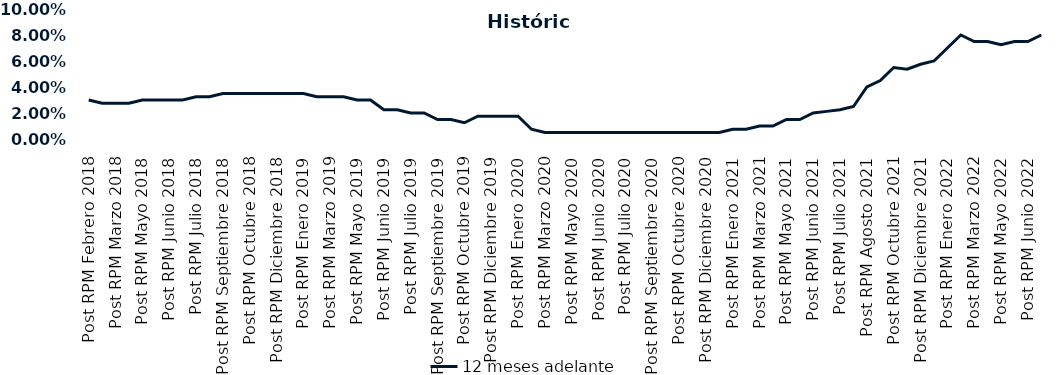
| Category | 12 meses adelante  |
|---|---|
| Post RPM Febrero 2018 | 0.03 |
| Pre RPM Marzo 2018 | 0.028 |
| Post RPM Marzo 2018 | 0.028 |
| Pre RPM Mayo 2018 | 0.028 |
| Post RPM Mayo 2018 | 0.03 |
| Pre RPM Junio 2018 | 0.03 |
| Post RPM Junio 2018 | 0.03 |
| Pre RPM Julio 2018 | 0.03 |
| Post RPM Julio 2018 | 0.032 |
| Pre RPM Septiembre 2018 | 0.032 |
| Post RPM Septiembre 2018 | 0.035 |
| Pre RPM Octubre 2018 | 0.035 |
| Post RPM Octubre 2018 | 0.035 |
| Pre RPM Diciembre 2018 | 0.035 |
| Post RPM Diciembre 2018 | 0.035 |
| Pre RPM Enero 2019 | 0.035 |
| Post RPM Enero 2019 | 0.035 |
| Pre RPM Marzo 2019 | 0.032 |
| Post RPM Marzo 2019 | 0.032 |
| Pre RPM Mayo 2019 | 0.032 |
| Post RPM Mayo 2019 | 0.03 |
| Pre RPM Junio 2019 | 0.03 |
| Post RPM Junio 2019 | 0.022 |
| Pre RPM Julio 2019 | 0.022 |
| Post RPM Julio 2019 | 0.02 |
| Pre RPM Septiembre 2019 | 0.02 |
| Post RPM Septiembre 2019 | 0.015 |
| Pre RPM Octubre 2019 | 0.015 |
| Post RPM Octubre 2019 | 0.012 |
| Pre RPM Diciembre 2019 | 0.018 |
| Post RPM Diciembre 2019 | 0.018 |
| Pre RPM Enero 2020 | 0.018 |
| Post RPM Enero 2020 | 0.018 |
| Pre RPM Marzo 2020 | 0.008 |
| Post RPM Marzo 2020 | 0.005 |
| Pre RPM Mayo 2020 | 0.005 |
| Post RPM Mayo 2020 | 0.005 |
| Pre RPM Junio 2020 | 0.005 |
| Post RPM Junio 2020 | 0.005 |
| Pre RPM Julio 2020 | 0.005 |
| Post RPM Julio 2020 | 0.005 |
| Pre RPM Septiembre 2020 | 0.005 |
| Post RPM Septiembre 2020 | 0.005 |
| Pre RPM Octubre 2020 | 0.005 |
| Post RPM Octubre 2020 | 0.005 |
| Pre RPM Diciembre 2020 | 0.005 |
| Post RPM Diciembre 2020 | 0.005 |
| Pre RPM Enero 2021 | 0.005 |
| Post RPM Enero 2021 | 0.008 |
| Pre RPM Marzo 2021 | 0.008 |
| Post RPM Marzo 2021 | 0.01 |
| Pre RPM Mayo 2021 | 0.01 |
| Post RPM Mayo 2021 | 0.015 |
| Pre RPM Junio 2021 | 0.015 |
| Post RPM Junio 2021 | 0.02 |
| Pre RPM Julio 2021 | 0.021 |
| Post RPM Julio 2021 | 0.022 |
| Pre RPM Agosto 2021 | 0.025 |
| Post RPM Agosto 2021 | 0.04 |
| Pre RPM Octubre 2021 | 0.045 |
| Post RPM Octubre 2021 | 0.055 |
| Pre RPM Diciembre 2021 | 0.054 |
| Post RPM Diciembre 2021 | 0.058 |
| Pre RPM Enero 2022 | 0.06 |
| Post RPM Enero 2022 | 0.07 |
| Pre RPM Marzo 2022 | 0.08 |
| Post RPM Marzo 2022 | 0.075 |
| Pre RPM Mayo 2022 | 0.075 |
| Post RPM Mayo 2022 | 0.072 |
| Pre RPM Junio 2022 | 0.075 |
| Post RPM Junio 2022 | 0.075 |
| Pre RPM Julio 2022 | 0.08 |